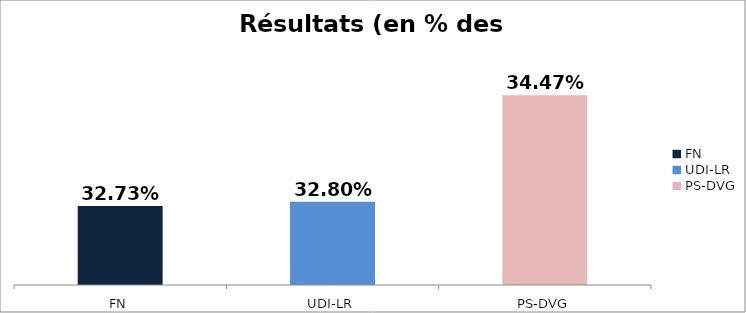
| Category | Résultats |
|---|---|
| FN | 0.327 |
| UDI-LR | 0.328 |
| PS-DVG | 0.345 |